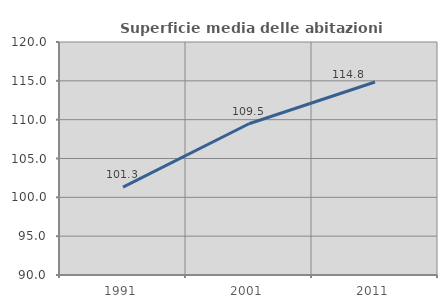
| Category | Superficie media delle abitazioni occupate |
|---|---|
| 1991.0 | 101.316 |
| 2001.0 | 109.476 |
| 2011.0 | 114.847 |